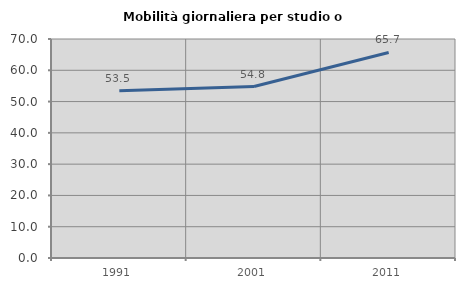
| Category | Mobilità giornaliera per studio o lavoro |
|---|---|
| 1991.0 | 53.452 |
| 2001.0 | 54.815 |
| 2011.0 | 65.698 |